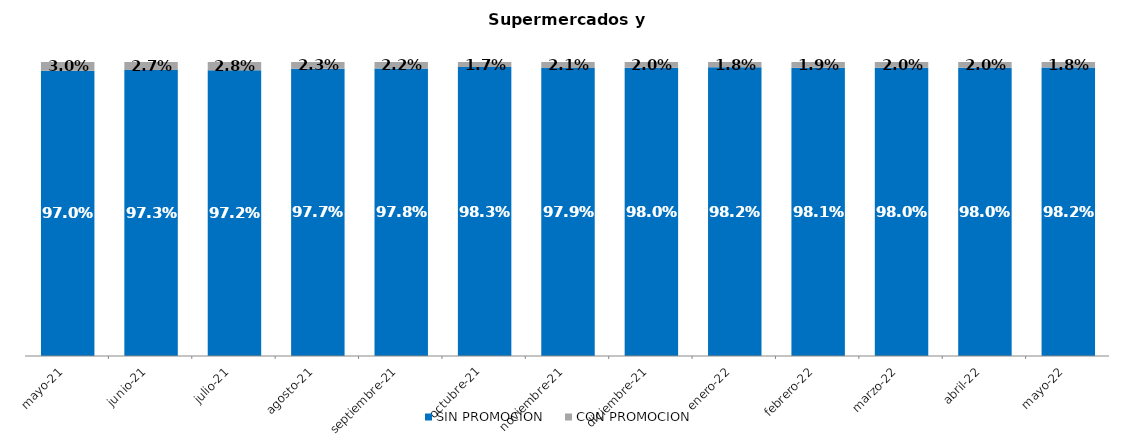
| Category | SIN PROMOCION   | CON PROMOCION   |
|---|---|---|
| 2021-05-01 | 0.97 | 0.03 |
| 2021-06-01 | 0.973 | 0.027 |
| 2021-07-01 | 0.972 | 0.028 |
| 2021-08-01 | 0.977 | 0.023 |
| 2021-09-01 | 0.978 | 0.022 |
| 2021-10-01 | 0.983 | 0.017 |
| 2021-11-01 | 0.979 | 0.021 |
| 2021-12-01 | 0.98 | 0.02 |
| 2022-01-01 | 0.982 | 0.018 |
| 2022-02-01 | 0.981 | 0.019 |
| 2022-03-01 | 0.98 | 0.02 |
| 2022-04-01 | 0.98 | 0.02 |
| 2022-05-01 | 0.982 | 0.018 |